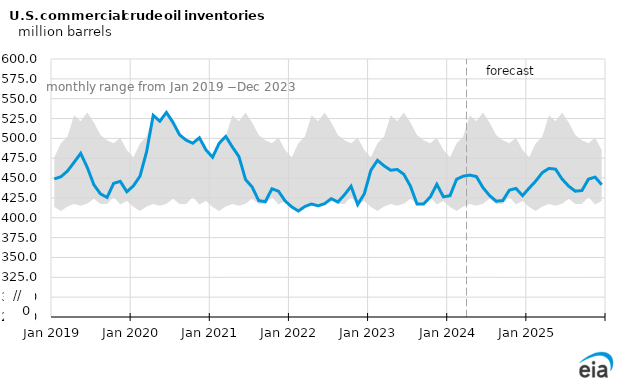
| Category | OECD commercial crude oil stocks |
|---|---|
| 2019-01-01 | 448.972 |
| 2019-02-01 | 451.66 |
| 2019-03-01 | 458.89 |
| 2019-04-01 | 469.802 |
| 2019-05-01 | 481.125 |
| 2019-06-01 | 463.446 |
| 2019-07-01 | 441.588 |
| 2019-08-01 | 430.118 |
| 2019-09-01 | 425.614 |
| 2019-10-01 | 443.367 |
| 2019-11-01 | 445.887 |
| 2019-12-01 | 432.772 |
| 2020-01-01 | 440.253 |
| 2020-02-01 | 452.563 |
| 2020-03-01 | 483.341 |
| 2020-04-01 | 529.035 |
| 2020-05-01 | 521.593 |
| 2020-06-01 | 532.657 |
| 2020-07-01 | 520.124 |
| 2020-08-01 | 504.399 |
| 2020-09-01 | 497.724 |
| 2020-10-01 | 493.922 |
| 2020-11-01 | 500.752 |
| 2020-12-01 | 485.471 |
| 2021-01-01 | 476.269 |
| 2021-02-01 | 493.876 |
| 2021-03-01 | 502.464 |
| 2021-04-01 | 489.158 |
| 2021-05-01 | 476.98 |
| 2021-06-01 | 448.108 |
| 2021-07-01 | 438.745 |
| 2021-08-01 | 421.525 |
| 2021-09-01 | 420.343 |
| 2021-10-01 | 436.58 |
| 2021-11-01 | 433.387 |
| 2021-12-01 | 421.184 |
| 2022-01-01 | 413.714 |
| 2022-02-01 | 408.526 |
| 2022-03-01 | 414.207 |
| 2022-04-01 | 417.382 |
| 2022-05-01 | 415.065 |
| 2022-06-01 | 417.799 |
| 2022-07-01 | 424.075 |
| 2022-08-01 | 419.785 |
| 2022-09-01 | 429 |
| 2022-10-01 | 439.678 |
| 2022-11-01 | 416.621 |
| 2022-12-01 | 430.102 |
| 2023-01-01 | 459.807 |
| 2023-02-01 | 472.357 |
| 2023-03-01 | 465.437 |
| 2023-04-01 | 459.882 |
| 2023-05-01 | 460.82 |
| 2023-06-01 | 454.734 |
| 2023-07-01 | 439.786 |
| 2023-08-01 | 417.299 |
| 2023-09-01 | 417.465 |
| 2023-10-01 | 426.067 |
| 2023-11-01 | 442.136 |
| 2023-12-01 | 426.388 |
| 2024-01-01 | 427.857 |
| 2024-02-01 | 448.53 |
| 2024-03-01 | 452.404 |
| 2024-04-01 | 453.758 |
| 2024-05-01 | 451.921 |
| 2024-06-01 | 437.911 |
| 2024-07-01 | 427.963 |
| 2024-08-01 | 420.883 |
| 2024-09-01 | 421.627 |
| 2024-10-01 | 434.808 |
| 2024-11-01 | 436.966 |
| 2024-12-01 | 427.918 |
| 2025-01-01 | 437.386 |
| 2025-02-01 | 446.223 |
| 2025-03-01 | 456.927 |
| 2025-04-01 | 462.144 |
| 2025-05-01 | 461.252 |
| 2025-06-01 | 448.682 |
| 2025-07-01 | 439.778 |
| 2025-08-01 | 433.504 |
| 2025-09-01 | 434.278 |
| 2025-10-01 | 448.707 |
| 2025-11-01 | 451.22 |
| 2025-12-01 | 441.589 |